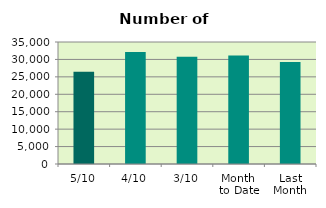
| Category | Series 0 |
|---|---|
| 5/10 | 26472 |
| 4/10 | 32166 |
| 3/10 | 30790 |
| Month 
to Date | 31146 |
| Last
Month | 29250.6 |